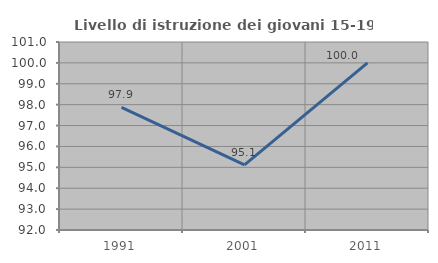
| Category | Livello di istruzione dei giovani 15-19 anni |
|---|---|
| 1991.0 | 97.872 |
| 2001.0 | 95.122 |
| 2011.0 | 100 |